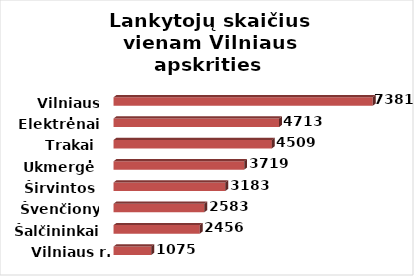
| Category | Series 0 |
|---|---|
| Vilniaus r. | 1075 |
| Šalčininkai | 2456 |
| Švenčionys | 2583 |
| Širvintos | 3183 |
| Ukmergė | 3719 |
| Trakai | 4509 |
| Elektrėnai | 4713 |
| Vilniaus m. | 7381 |